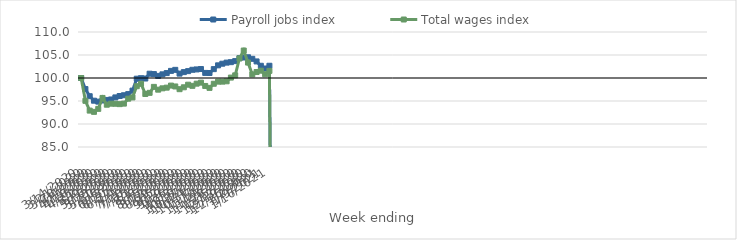
| Category | Payroll jobs index | Total wages index |
|---|---|---|
| 14/03/2020 | 100 | 100 |
| 21/03/2020 | 97.598 | 95.035 |
| 28/03/2020 | 96.041 | 92.911 |
| 04/04/2020 | 95.065 | 92.641 |
| 11/04/2020 | 94.861 | 93.288 |
| 18/04/2020 | 95.106 | 95.667 |
| 25/04/2020 | 95.229 | 94.195 |
| 02/05/2020 | 95.333 | 94.418 |
| 09/05/2020 | 95.781 | 94.399 |
| 16/05/2020 | 96.086 | 94.318 |
| 23/05/2020 | 96.253 | 94.43 |
| 30/05/2020 | 96.5 | 95.502 |
| 06/06/2020 | 97.256 | 95.773 |
| 13/06/2020 | 99.85 | 98.218 |
| 20/06/2020 | 99.957 | 98.741 |
| 27/06/2020 | 99.886 | 96.525 |
| 04/07/2020 | 100.934 | 96.773 |
| 11/07/2020 | 100.853 | 98.068 |
| 18/07/2020 | 100.459 | 97.465 |
| 25/07/2020 | 100.797 | 97.752 |
| 01/08/2020 | 101.071 | 97.902 |
| 08/08/2020 | 101.546 | 98.352 |
| 15/08/2020 | 101.77 | 98.161 |
| 22/08/2020 | 100.954 | 97.571 |
| 29/08/2020 | 101.28 | 97.982 |
| 05/09/2020 | 101.493 | 98.543 |
| 12/09/2020 | 101.785 | 98.295 |
| 19/09/2020 | 101.865 | 98.77 |
| 26/09/2020 | 101.95 | 98.991 |
| 03/10/2020 | 101.106 | 98.271 |
| 10/10/2020 | 101.084 | 97.853 |
| 17/10/2020 | 101.926 | 98.748 |
| 24/10/2020 | 102.752 | 99.209 |
| 31/10/2020 | 103.107 | 99.211 |
| 07/11/2020 | 103.344 | 99.283 |
| 14/11/2020 | 103.441 | 100.089 |
| 21/11/2020 | 103.67 | 100.576 |
| 28/11/2020 | 104.319 | 104.258 |
| 05/12/2020 | 104.455 | 105.97 |
| 12/12/2020 | 104.501 | 103.355 |
| 19/12/2020 | 104.17 | 100.779 |
| 26/12/2020 | 103.603 | 101.299 |
| 02/01/2021 | 102.656 | 101.595 |
| 09/01/2021 | 102.068 | 100.814 |
| 16/01/2021 | 102.66 | 101.544 |